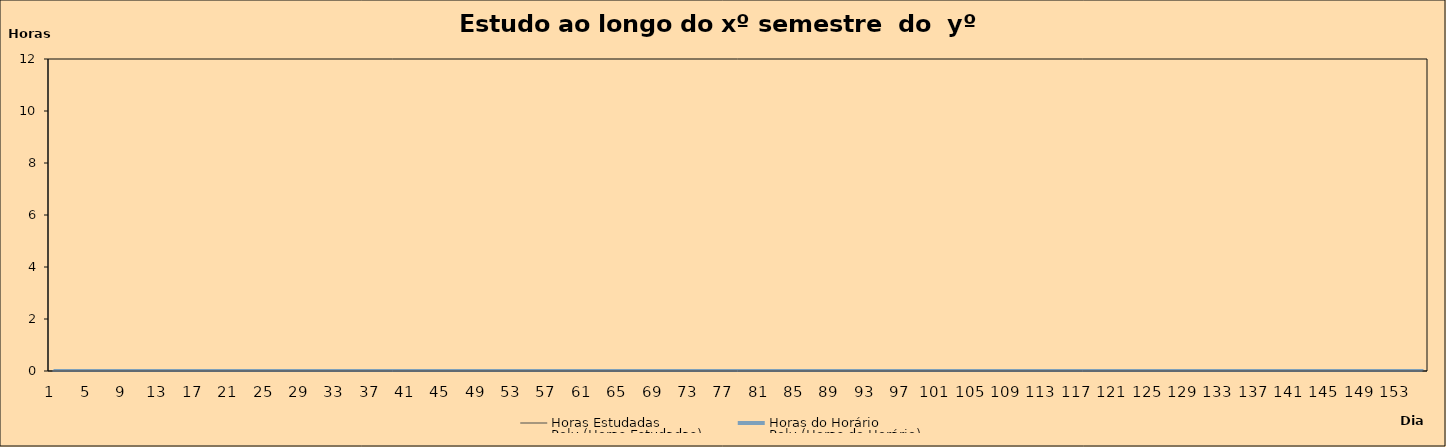
| Category | Horas Estudadas | Horas do Horário |
|---|---|---|
| 0 | 0 | 0 |
| 1 | 0 | 0 |
| 2 | 0 | 0 |
| 3 | 0 | 0 |
| 4 | 0 | 0 |
| 5 | 0 | 0 |
| 6 | 0 | 0 |
| 7 | 0 | 0 |
| 8 | 0 | 0 |
| 9 | 0 | 0 |
| 10 | 0 | 0 |
| 11 | 0 | 0 |
| 12 | 0 | 0 |
| 13 | 0 | 0 |
| 14 | 0 | 0 |
| 15 | 0 | 0 |
| 16 | 0 | 0 |
| 17 | 0 | 0 |
| 18 | 0 | 0 |
| 19 | 0 | 0 |
| 20 | 0 | 0 |
| 21 | 0 | 0 |
| 22 | 0 | 0 |
| 23 | 0 | 0 |
| 24 | 0 | 0 |
| 25 | 0 | 0 |
| 26 | 0 | 0 |
| 27 | 0 | 0 |
| 28 | 0 | 0 |
| 29 | 0 | 0 |
| 30 | 0 | 0 |
| 31 | 0 | 0 |
| 32 | 0 | 0 |
| 33 | 0 | 0 |
| 34 | 0 | 0 |
| 35 | 0 | 0 |
| 36 | 0 | 0 |
| 37 | 0 | 0 |
| 38 | 0 | 0 |
| 39 | 0 | 0 |
| 40 | 0 | 0 |
| 41 | 0 | 0 |
| 42 | 0 | 0 |
| 43 | 0 | 0 |
| 44 | 0 | 0 |
| 45 | 0 | 0 |
| 46 | 0 | 0 |
| 47 | 0 | 0 |
| 48 | 0 | 0 |
| 49 | 0 | 0 |
| 50 | 0 | 0 |
| 51 | 0 | 0 |
| 52 | 0 | 0 |
| 53 | 0 | 0 |
| 54 | 0 | 0 |
| 55 | 0 | 0 |
| 56 | 0 | 0 |
| 57 | 0 | 0 |
| 58 | 0 | 0 |
| 59 | 0 | 0 |
| 60 | 0 | 0 |
| 61 | 0 | 0 |
| 62 | 0 | 0 |
| 63 | 0 | 0 |
| 64 | 0 | 0 |
| 65 | 0 | 0 |
| 66 | 0 | 0 |
| 67 | 0 | 0 |
| 68 | 0 | 0 |
| 69 | 0 | 0 |
| 70 | 0 | 0 |
| 71 | 0 | 0 |
| 72 | 0 | 0 |
| 73 | 0 | 0 |
| 74 | 0 | 0 |
| 75 | 0 | 0 |
| 76 | 0 | 0 |
| 77 | 0 | 0 |
| 78 | 0 | 0 |
| 79 | 0 | 0 |
| 80 | 0 | 0 |
| 81 | 0 | 0 |
| 82 | 0 | 0 |
| 83 | 0 | 0 |
| 84 | 0 | 0 |
| 85 | 0 | 0 |
| 86 | 0 | 0 |
| 87 | 0 | 0 |
| 88 | 0 | 0 |
| 89 | 0 | 0 |
| 90 | 0 | 0 |
| 91 | 0 | 0 |
| 92 | 0 | 0 |
| 93 | 0 | 0 |
| 94 | 0 | 0 |
| 95 | 0 | 0 |
| 96 | 0 | 0 |
| 97 | 0 | 0 |
| 98 | 0 | 0 |
| 99 | 0 | 0 |
| 100 | 0 | 0 |
| 101 | 0 | 0 |
| 102 | 0 | 0 |
| 103 | 0 | 0 |
| 104 | 0 | 0 |
| 105 | 0 | 0 |
| 106 | 0 | 0 |
| 107 | 0 | 0 |
| 108 | 0 | 0 |
| 109 | 0 | 0 |
| 110 | 0 | 0 |
| 111 | 0 | 0 |
| 112 | 0 | 0 |
| 113 | 0 | 0 |
| 114 | 0 | 0 |
| 115 | 0 | 0 |
| 116 | 0 | 0 |
| 117 | 0 | 0 |
| 118 | 0 | 0 |
| 119 | 0 | 0 |
| 120 | 0 | 0 |
| 121 | 0 | 0 |
| 122 | 0 | 0 |
| 123 | 0 | 0 |
| 124 | 0 | 0 |
| 125 | 0 | 0 |
| 126 | 0 | 0 |
| 127 | 0 | 0 |
| 128 | 0 | 0 |
| 129 | 0 | 0 |
| 130 | 0 | 0 |
| 131 | 0 | 0 |
| 132 | 0 | 0 |
| 133 | 0 | 0 |
| 134 | 0 | 0 |
| 135 | 0 | 0 |
| 136 | 0 | 0 |
| 137 | 0 | 0 |
| 138 | 0 | 0 |
| 139 | 0 | 0 |
| 140 | 0 | 0 |
| 141 | 0 | 0 |
| 142 | 0 | 0 |
| 143 | 0 | 0 |
| 144 | 0 | 0 |
| 145 | 0 | 0 |
| 146 | 0 | 0 |
| 147 | 0 | 0 |
| 148 | 0 | 0 |
| 149 | 0 | 0 |
| 150 | 0 | 0 |
| 151 | 0 | 0 |
| 152 | 0 | 0 |
| 153 | 0 | 0 |
| 154 | 0 | 0 |
| 155 | 0 | 0 |